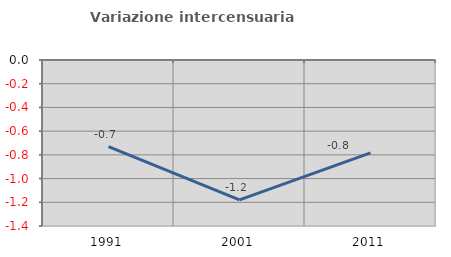
| Category | Variazione intercensuaria annua |
|---|---|
| 1991.0 | -0.731 |
| 2001.0 | -1.18 |
| 2011.0 | -0.783 |